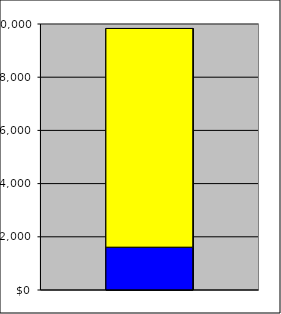
| Category | Series 0 | Series 1 |
|---|---|---|
| 0 | 1609.498 | 8222.502 |